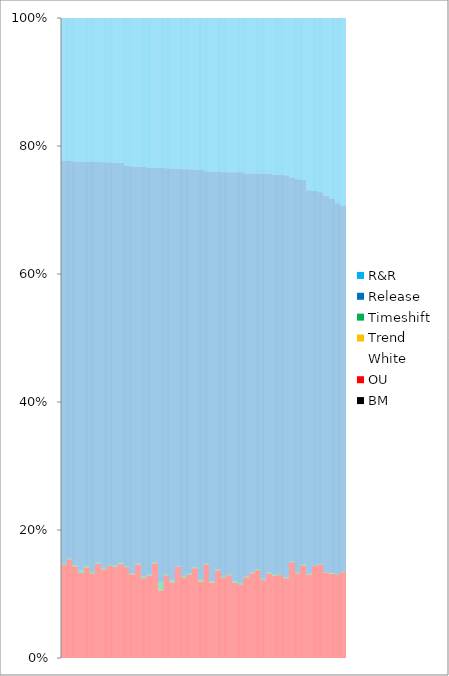
| Category | BM | OU | White | Trend | Timeshift | Release | R&R |
|---|---|---|---|---|---|---|---|
| 0 | 0 | 0.145 | 0 | 0 | 0.002 | 0.63 | 0.223 |
| 1 | 0 | 0.145 | 0 | 0 | 0.002 | 0.63 | 0.223 |
| 2 | 0 | 0.145 | 0 | 0 | 0.002 | 0.63 | 0.223 |
| 3 | 0 | 0.145 | 0 | 0 | 0.002 | 0.63 | 0.223 |
| 4 | 0 | 0.145 | 0 | 0 | 0.002 | 0.63 | 0.223 |
| 5 | 0 | 0.145 | 0 | 0 | 0.002 | 0.63 | 0.223 |
| 6 | 0 | 0.154 | 0 | 0 | 0.001 | 0.621 | 0.223 |
| 7 | 0 | 0.154 | 0 | 0 | 0.001 | 0.621 | 0.223 |
| 8 | 0 | 0.154 | 0 | 0 | 0.001 | 0.621 | 0.223 |
| 9 | 0 | 0.154 | 0 | 0 | 0.001 | 0.621 | 0.223 |
| 10 | 0 | 0.154 | 0 | 0 | 0.001 | 0.621 | 0.223 |
| 11 | 0 | 0.154 | 0 | 0 | 0.001 | 0.621 | 0.223 |
| 12 | 0 | 0.143 | 0 | 0 | 0.002 | 0.631 | 0.224 |
| 13 | 0 | 0.143 | 0 | 0 | 0.002 | 0.631 | 0.224 |
| 14 | 0 | 0.143 | 0 | 0 | 0.002 | 0.631 | 0.224 |
| 15 | 0 | 0.143 | 0 | 0 | 0.002 | 0.631 | 0.224 |
| 16 | 0 | 0.143 | 0 | 0 | 0.002 | 0.631 | 0.224 |
| 17 | 0 | 0.143 | 0 | 0 | 0.002 | 0.631 | 0.224 |
| 18 | 0 | 0.133 | 0 | 0 | 0.004 | 0.639 | 0.224 |
| 19 | 0 | 0.133 | 0 | 0 | 0.004 | 0.639 | 0.224 |
| 20 | 0 | 0.133 | 0 | 0 | 0.004 | 0.639 | 0.224 |
| 21 | 0 | 0.133 | 0 | 0 | 0.004 | 0.639 | 0.224 |
| 22 | 0 | 0.133 | 0 | 0 | 0.004 | 0.639 | 0.224 |
| 23 | 0 | 0.133 | 0 | 0 | 0.004 | 0.639 | 0.224 |
| 24 | 0 | 0.141 | 0 | 0 | 0.003 | 0.631 | 0.225 |
| 25 | 0 | 0.141 | 0 | 0 | 0.003 | 0.631 | 0.225 |
| 26 | 0 | 0.141 | 0 | 0 | 0.003 | 0.631 | 0.225 |
| 27 | 0 | 0.141 | 0 | 0 | 0.003 | 0.631 | 0.225 |
| 28 | 0 | 0.141 | 0 | 0 | 0.003 | 0.631 | 0.225 |
| 29 | 0 | 0.141 | 0 | 0 | 0.003 | 0.631 | 0.225 |
| 30 | 0 | 0.132 | 0 | 0 | 0.003 | 0.64 | 0.225 |
| 31 | 0 | 0.132 | 0 | 0 | 0.003 | 0.64 | 0.225 |
| 32 | 0 | 0.132 | 0 | 0 | 0.003 | 0.64 | 0.225 |
| 33 | 0 | 0.132 | 0 | 0 | 0.003 | 0.64 | 0.225 |
| 34 | 0 | 0.132 | 0 | 0 | 0.003 | 0.64 | 0.225 |
| 35 | 0 | 0.132 | 0 | 0 | 0.003 | 0.64 | 0.225 |
| 36 | 0 | 0.147 | 0 | 0 | 0.002 | 0.626 | 0.225 |
| 37 | 0 | 0.147 | 0 | 0 | 0.002 | 0.626 | 0.225 |
| 38 | 0 | 0.147 | 0 | 0 | 0.002 | 0.626 | 0.225 |
| 39 | 0 | 0.147 | 0 | 0 | 0.002 | 0.626 | 0.225 |
| 40 | 0 | 0.147 | 0 | 0 | 0.002 | 0.626 | 0.225 |
| 41 | 0 | 0.147 | 0 | 0 | 0.002 | 0.626 | 0.225 |
| 42 | 0 | 0.138 | 0 | 0 | 0.003 | 0.634 | 0.225 |
| 43 | 0 | 0.138 | 0 | 0 | 0.003 | 0.634 | 0.225 |
| 44 | 0 | 0.138 | 0 | 0 | 0.003 | 0.634 | 0.225 |
| 45 | 0 | 0.138 | 0 | 0 | 0.003 | 0.634 | 0.225 |
| 46 | 0 | 0.138 | 0 | 0 | 0.003 | 0.634 | 0.225 |
| 47 | 0 | 0.138 | 0 | 0 | 0.003 | 0.634 | 0.225 |
| 48 | 0 | 0.144 | 0 | 0 | 0.002 | 0.629 | 0.226 |
| 49 | 0 | 0.144 | 0 | 0 | 0.002 | 0.629 | 0.226 |
| 50 | 0 | 0.144 | 0 | 0 | 0.002 | 0.629 | 0.226 |
| 51 | 0 | 0.144 | 0 | 0 | 0.002 | 0.629 | 0.226 |
| 52 | 0 | 0.144 | 0 | 0 | 0.002 | 0.629 | 0.226 |
| 53 | 0 | 0.144 | 0 | 0 | 0.002 | 0.629 | 0.226 |
| 54 | 0 | 0.142 | 0 | 0 | 0.002 | 0.629 | 0.227 |
| 55 | 0 | 0.142 | 0 | 0 | 0.002 | 0.629 | 0.227 |
| 56 | 0 | 0.142 | 0 | 0 | 0.002 | 0.629 | 0.227 |
| 57 | 0 | 0.142 | 0 | 0 | 0.002 | 0.629 | 0.227 |
| 58 | 0 | 0.142 | 0 | 0 | 0.002 | 0.629 | 0.227 |
| 59 | 0 | 0.142 | 0 | 0 | 0.002 | 0.629 | 0.227 |
| 60 | 0 | 0.146 | 0 | 0 | 0.002 | 0.624 | 0.227 |
| 61 | 0 | 0.146 | 0 | 0 | 0.002 | 0.624 | 0.227 |
| 62 | 0 | 0.146 | 0 | 0 | 0.002 | 0.624 | 0.227 |
| 63 | 0 | 0.146 | 0 | 0 | 0.002 | 0.624 | 0.227 |
| 64 | 0 | 0.146 | 0 | 0 | 0.002 | 0.624 | 0.227 |
| 65 | 0 | 0.146 | 0 | 0 | 0.002 | 0.624 | 0.227 |
| 66 | 0 | 0.142 | 0 | 0 | 0.001 | 0.626 | 0.231 |
| 67 | 0 | 0.142 | 0 | 0 | 0.001 | 0.626 | 0.231 |
| 68 | 0 | 0.142 | 0 | 0 | 0.001 | 0.626 | 0.231 |
| 69 | 0 | 0.142 | 0 | 0 | 0.001 | 0.626 | 0.231 |
| 70 | 0 | 0.142 | 0 | 0 | 0.001 | 0.626 | 0.231 |
| 71 | 0 | 0.142 | 0 | 0 | 0.001 | 0.626 | 0.231 |
| 72 | 0 | 0.13 | 0 | 0 | 0.002 | 0.635 | 0.232 |
| 73 | 0 | 0.13 | 0 | 0 | 0.002 | 0.635 | 0.232 |
| 74 | 0 | 0.13 | 0 | 0 | 0.002 | 0.635 | 0.232 |
| 75 | 0 | 0.13 | 0 | 0 | 0.002 | 0.635 | 0.232 |
| 76 | 0 | 0.13 | 0 | 0 | 0.002 | 0.635 | 0.232 |
| 77 | 0 | 0.13 | 0 | 0 | 0.002 | 0.635 | 0.232 |
| 78 | 0 | 0.146 | 0 | 0 | 0.002 | 0.62 | 0.232 |
| 79 | 0 | 0.146 | 0 | 0 | 0.002 | 0.62 | 0.232 |
| 80 | 0 | 0.146 | 0 | 0 | 0.002 | 0.62 | 0.232 |
| 81 | 0 | 0.146 | 0 | 0 | 0.002 | 0.62 | 0.232 |
| 82 | 0 | 0.146 | 0 | 0 | 0.002 | 0.62 | 0.232 |
| 83 | 0 | 0.146 | 0 | 0 | 0.002 | 0.62 | 0.232 |
| 84 | 0 | 0.124 | 0 | 0 | 0.003 | 0.64 | 0.233 |
| 85 | 0 | 0.124 | 0 | 0 | 0.003 | 0.64 | 0.233 |
| 86 | 0 | 0.124 | 0 | 0 | 0.003 | 0.64 | 0.233 |
| 87 | 0 | 0.124 | 0 | 0 | 0.003 | 0.64 | 0.233 |
| 88 | 0 | 0.124 | 0 | 0 | 0.003 | 0.64 | 0.233 |
| 89 | 0 | 0.124 | 0 | 0 | 0.003 | 0.64 | 0.233 |
| 90 | 0 | 0.128 | 0 | 0 | 0.002 | 0.635 | 0.234 |
| 91 | 0 | 0.128 | 0 | 0 | 0.002 | 0.635 | 0.234 |
| 92 | 0 | 0.128 | 0 | 0 | 0.002 | 0.635 | 0.234 |
| 93 | 0 | 0.128 | 0 | 0 | 0.002 | 0.635 | 0.234 |
| 94 | 0 | 0.128 | 0 | 0 | 0.002 | 0.635 | 0.234 |
| 95 | 0 | 0.128 | 0 | 0 | 0.002 | 0.635 | 0.234 |
| 96 | 0 | 0.148 | 0 | 0 | 0.001 | 0.616 | 0.234 |
| 97 | 0 | 0.148 | 0 | 0 | 0.001 | 0.616 | 0.234 |
| 98 | 0 | 0.148 | 0 | 0 | 0.001 | 0.616 | 0.234 |
| 99 | 0 | 0.148 | 0 | 0 | 0.001 | 0.616 | 0.234 |
| 100 | 0 | 0.148 | 0 | 0 | 0.001 | 0.616 | 0.234 |
| 101 | 0 | 0.148 | 0 | 0 | 0.001 | 0.616 | 0.234 |
| 102 | 0 | 0.106 | 0 | 0 | 0.013 | 0.647 | 0.234 |
| 103 | 0 | 0.106 | 0 | 0 | 0.013 | 0.647 | 0.234 |
| 104 | 0 | 0.106 | 0 | 0 | 0.013 | 0.647 | 0.234 |
| 105 | 0 | 0.106 | 0 | 0 | 0.013 | 0.647 | 0.234 |
| 106 | 0 | 0.106 | 0 | 0 | 0.013 | 0.647 | 0.234 |
| 107 | 0 | 0.106 | 0 | 0 | 0.013 | 0.647 | 0.234 |
| 108 | 0 | 0.129 | 0 | 0 | 0.002 | 0.634 | 0.235 |
| 109 | 0 | 0.129 | 0 | 0 | 0.002 | 0.634 | 0.235 |
| 110 | 0 | 0.129 | 0 | 0 | 0.002 | 0.634 | 0.235 |
| 111 | 0 | 0.129 | 0 | 0 | 0.002 | 0.634 | 0.235 |
| 112 | 0 | 0.129 | 0 | 0 | 0.002 | 0.634 | 0.235 |
| 113 | 0 | 0.129 | 0 | 0 | 0.002 | 0.634 | 0.235 |
| 114 | 0 | 0.118 | 0 | 0 | 0.003 | 0.644 | 0.235 |
| 115 | 0 | 0.118 | 0 | 0 | 0.003 | 0.644 | 0.235 |
| 116 | 0 | 0.118 | 0 | 0 | 0.003 | 0.644 | 0.235 |
| 117 | 0 | 0.118 | 0 | 0 | 0.003 | 0.644 | 0.235 |
| 118 | 0 | 0.118 | 0 | 0 | 0.003 | 0.644 | 0.235 |
| 119 | 0 | 0.118 | 0 | 0 | 0.003 | 0.644 | 0.235 |
| 120 | 0 | 0.142 | 0 | 0 | 0.001 | 0.621 | 0.236 |
| 121 | 0 | 0.142 | 0 | 0 | 0.001 | 0.621 | 0.236 |
| 122 | 0 | 0.142 | 0 | 0 | 0.001 | 0.621 | 0.236 |
| 123 | 0 | 0.142 | 0 | 0 | 0.001 | 0.621 | 0.236 |
| 124 | 0 | 0.142 | 0 | 0 | 0.001 | 0.621 | 0.236 |
| 125 | 0 | 0.142 | 0 | 0 | 0.001 | 0.621 | 0.236 |
| 126 | 0 | 0.125 | 0 | 0 | 0.003 | 0.635 | 0.236 |
| 127 | 0 | 0.125 | 0 | 0 | 0.003 | 0.635 | 0.236 |
| 128 | 0 | 0.125 | 0 | 0 | 0.003 | 0.635 | 0.236 |
| 129 | 0 | 0.125 | 0 | 0 | 0.003 | 0.635 | 0.236 |
| 130 | 0 | 0.125 | 0 | 0 | 0.003 | 0.635 | 0.236 |
| 131 | 0 | 0.125 | 0 | 0 | 0.003 | 0.635 | 0.236 |
| 132 | 0 | 0.13 | 0 | 0 | 0.002 | 0.631 | 0.236 |
| 133 | 0 | 0.13 | 0 | 0 | 0.002 | 0.631 | 0.236 |
| 134 | 0 | 0.13 | 0 | 0 | 0.002 | 0.631 | 0.236 |
| 135 | 0 | 0.13 | 0 | 0 | 0.002 | 0.631 | 0.236 |
| 136 | 0 | 0.13 | 0 | 0 | 0.002 | 0.631 | 0.236 |
| 137 | 0 | 0.13 | 0 | 0 | 0.002 | 0.631 | 0.236 |
| 138 | 0 | 0.14 | 0 | 0 | 0.002 | 0.621 | 0.237 |
| 139 | 0 | 0.14 | 0 | 0 | 0.002 | 0.621 | 0.237 |
| 140 | 0 | 0.14 | 0 | 0 | 0.002 | 0.621 | 0.237 |
| 141 | 0 | 0.14 | 0 | 0 | 0.002 | 0.621 | 0.237 |
| 142 | 0 | 0.14 | 0 | 0 | 0.002 | 0.621 | 0.237 |
| 143 | 0 | 0.14 | 0 | 0 | 0.002 | 0.621 | 0.237 |
| 144 | 0 | 0.119 | 0 | 0 | 0.003 | 0.64 | 0.237 |
| 145 | 0 | 0.119 | 0 | 0 | 0.003 | 0.64 | 0.237 |
| 146 | 0 | 0.119 | 0 | 0 | 0.003 | 0.64 | 0.237 |
| 147 | 0 | 0.119 | 0 | 0 | 0.003 | 0.64 | 0.237 |
| 148 | 0 | 0.119 | 0 | 0 | 0.003 | 0.64 | 0.237 |
| 149 | 0 | 0.119 | 0 | 0 | 0.003 | 0.64 | 0.237 |
| 150 | 0 | 0.146 | 0 | 0 | 0.001 | 0.613 | 0.24 |
| 151 | 0 | 0.146 | 0 | 0 | 0.001 | 0.613 | 0.24 |
| 152 | 0 | 0.146 | 0 | 0 | 0.001 | 0.613 | 0.24 |
| 153 | 0 | 0.146 | 0 | 0 | 0.001 | 0.613 | 0.24 |
| 154 | 0 | 0.146 | 0 | 0 | 0.001 | 0.613 | 0.24 |
| 155 | 0 | 0.146 | 0 | 0 | 0.001 | 0.613 | 0.24 |
| 156 | 0 | 0.117 | 0 | 0 | 0.002 | 0.64 | 0.24 |
| 157 | 0 | 0.117 | 0 | 0 | 0.002 | 0.64 | 0.24 |
| 158 | 0 | 0.117 | 0 | 0 | 0.002 | 0.64 | 0.24 |
| 159 | 0 | 0.117 | 0 | 0 | 0.002 | 0.64 | 0.24 |
| 160 | 0 | 0.117 | 0 | 0 | 0.002 | 0.64 | 0.24 |
| 161 | 0 | 0.117 | 0 | 0 | 0.002 | 0.64 | 0.24 |
| 162 | 0 | 0.137 | 0 | 0 | 0.002 | 0.621 | 0.24 |
| 163 | 0 | 0.137 | 0 | 0 | 0.002 | 0.621 | 0.24 |
| 164 | 0 | 0.137 | 0 | 0 | 0.002 | 0.621 | 0.24 |
| 165 | 0 | 0.137 | 0 | 0 | 0.002 | 0.621 | 0.24 |
| 166 | 0 | 0.137 | 0 | 0 | 0.002 | 0.621 | 0.24 |
| 167 | 0 | 0.137 | 0 | 0 | 0.002 | 0.621 | 0.24 |
| 168 | 0 | 0.125 | 0 | 0 | 0.002 | 0.632 | 0.241 |
| 169 | 0 | 0.125 | 0 | 0 | 0.002 | 0.632 | 0.241 |
| 170 | 0 | 0.125 | 0 | 0 | 0.002 | 0.632 | 0.241 |
| 171 | 0 | 0.125 | 0 | 0 | 0.002 | 0.632 | 0.241 |
| 172 | 0 | 0.125 | 0 | 0 | 0.002 | 0.632 | 0.241 |
| 173 | 0 | 0.125 | 0 | 0 | 0.002 | 0.632 | 0.241 |
| 174 | 0 | 0.129 | 0 | 0 | 0.002 | 0.628 | 0.241 |
| 175 | 0 | 0.129 | 0 | 0 | 0.002 | 0.628 | 0.241 |
| 176 | 0 | 0.129 | 0 | 0 | 0.002 | 0.628 | 0.241 |
| 177 | 0 | 0.129 | 0 | 0 | 0.002 | 0.628 | 0.241 |
| 178 | 0 | 0.129 | 0 | 0 | 0.002 | 0.628 | 0.241 |
| 179 | 0 | 0.129 | 0 | 0 | 0.002 | 0.628 | 0.241 |
| 180 | 0 | 0.117 | 0 | 0 | 0.002 | 0.64 | 0.241 |
| 181 | 0 | 0.117 | 0 | 0 | 0.002 | 0.64 | 0.241 |
| 182 | 0 | 0.117 | 0 | 0 | 0.002 | 0.64 | 0.241 |
| 183 | 0 | 0.117 | 0 | 0 | 0.002 | 0.64 | 0.241 |
| 184 | 0 | 0.117 | 0 | 0 | 0.002 | 0.64 | 0.241 |
| 185 | 0 | 0.117 | 0 | 0 | 0.002 | 0.64 | 0.241 |
| 186 | 0 | 0.115 | 0 | 0 | 0.002 | 0.642 | 0.241 |
| 187 | 0 | 0.115 | 0 | 0 | 0.002 | 0.642 | 0.241 |
| 188 | 0 | 0.115 | 0 | 0 | 0.002 | 0.642 | 0.241 |
| 189 | 0 | 0.115 | 0 | 0 | 0.002 | 0.642 | 0.241 |
| 190 | 0 | 0.115 | 0 | 0 | 0.002 | 0.642 | 0.241 |
| 191 | 0 | 0.115 | 0 | 0 | 0.002 | 0.642 | 0.241 |
| 192 | 0 | 0.126 | 0 | 0 | 0.002 | 0.629 | 0.243 |
| 193 | 0 | 0.126 | 0 | 0 | 0.002 | 0.629 | 0.243 |
| 194 | 0 | 0.126 | 0 | 0 | 0.002 | 0.629 | 0.243 |
| 195 | 0 | 0.126 | 0 | 0 | 0.002 | 0.629 | 0.243 |
| 196 | 0 | 0.126 | 0 | 0 | 0.002 | 0.629 | 0.243 |
| 197 | 0 | 0.126 | 0 | 0 | 0.002 | 0.629 | 0.243 |
| 198 | 0 | 0.132 | 0 | 0 | 0.002 | 0.623 | 0.243 |
| 199 | 0 | 0.132 | 0 | 0 | 0.002 | 0.623 | 0.243 |
| 200 | 0 | 0.132 | 0 | 0 | 0.002 | 0.623 | 0.243 |
| 201 | 0 | 0.132 | 0 | 0 | 0.002 | 0.623 | 0.243 |
| 202 | 0 | 0.132 | 0 | 0 | 0.002 | 0.623 | 0.243 |
| 203 | 0 | 0.132 | 0 | 0 | 0.002 | 0.623 | 0.243 |
| 204 | 0 | 0.137 | 0 | 0 | 0.001 | 0.618 | 0.243 |
| 205 | 0 | 0.137 | 0 | 0 | 0.001 | 0.618 | 0.243 |
| 206 | 0 | 0.137 | 0 | 0 | 0.001 | 0.618 | 0.243 |
| 207 | 0 | 0.137 | 0 | 0 | 0.001 | 0.618 | 0.243 |
| 208 | 0 | 0.137 | 0 | 0 | 0.001 | 0.618 | 0.243 |
| 209 | 0 | 0.137 | 0 | 0 | 0.001 | 0.618 | 0.243 |
| 210 | 0 | 0.122 | 0 | 0 | 0.002 | 0.633 | 0.244 |
| 211 | 0 | 0.122 | 0 | 0 | 0.002 | 0.633 | 0.244 |
| 212 | 0 | 0.122 | 0 | 0 | 0.002 | 0.633 | 0.244 |
| 213 | 0 | 0.122 | 0 | 0 | 0.002 | 0.633 | 0.244 |
| 214 | 0 | 0.122 | 0 | 0 | 0.002 | 0.633 | 0.244 |
| 215 | 0 | 0.122 | 0 | 0 | 0.002 | 0.633 | 0.244 |
| 216 | 0 | 0.132 | 0 | 0 | 0.001 | 0.623 | 0.244 |
| 217 | 0 | 0.132 | 0 | 0 | 0.001 | 0.623 | 0.244 |
| 218 | 0 | 0.132 | 0 | 0 | 0.001 | 0.623 | 0.244 |
| 219 | 0 | 0.132 | 0 | 0 | 0.001 | 0.623 | 0.244 |
| 220 | 0 | 0.132 | 0 | 0 | 0.001 | 0.623 | 0.244 |
| 221 | 0 | 0.132 | 0 | 0 | 0.001 | 0.623 | 0.244 |
| 222 | 0 | 0.128 | 0 | 0 | 0.002 | 0.625 | 0.245 |
| 223 | 0 | 0.128 | 0 | 0 | 0.002 | 0.625 | 0.245 |
| 224 | 0 | 0.128 | 0 | 0 | 0.002 | 0.625 | 0.245 |
| 225 | 0 | 0.128 | 0 | 0 | 0.002 | 0.625 | 0.245 |
| 226 | 0 | 0.128 | 0 | 0 | 0.002 | 0.625 | 0.245 |
| 227 | 0 | 0.128 | 0 | 0 | 0.002 | 0.625 | 0.245 |
| 228 | 0 | 0.13 | 0 | 0 | 0.002 | 0.623 | 0.245 |
| 229 | 0 | 0.13 | 0 | 0 | 0.002 | 0.623 | 0.245 |
| 230 | 0 | 0.13 | 0 | 0 | 0.002 | 0.623 | 0.245 |
| 231 | 0 | 0.13 | 0 | 0 | 0.002 | 0.623 | 0.245 |
| 232 | 0 | 0.13 | 0 | 0 | 0.002 | 0.623 | 0.245 |
| 233 | 0 | 0.13 | 0 | 0 | 0.002 | 0.623 | 0.245 |
| 234 | 0 | 0.124 | 0 | 0 | 0.002 | 0.628 | 0.246 |
| 235 | 0 | 0.124 | 0 | 0 | 0.002 | 0.628 | 0.246 |
| 236 | 0 | 0.124 | 0 | 0 | 0.002 | 0.628 | 0.246 |
| 237 | 0 | 0.124 | 0 | 0 | 0.002 | 0.628 | 0.246 |
| 238 | 0 | 0.124 | 0 | 0 | 0.002 | 0.628 | 0.246 |
| 239 | 0 | 0.124 | 0 | 0 | 0.002 | 0.628 | 0.246 |
| 240 | 0 | 0.15 | 0 | 0 | 0.001 | 0.6 | 0.249 |
| 241 | 0 | 0.15 | 0 | 0 | 0.001 | 0.6 | 0.249 |
| 242 | 0 | 0.15 | 0 | 0 | 0.001 | 0.6 | 0.249 |
| 243 | 0 | 0.15 | 0 | 0 | 0.001 | 0.6 | 0.249 |
| 244 | 0 | 0.15 | 0 | 0 | 0.001 | 0.6 | 0.249 |
| 245 | 0 | 0.15 | 0 | 0 | 0.001 | 0.6 | 0.249 |
| 246 | 0 | 0.132 | 0 | 0 | 0.001 | 0.615 | 0.252 |
| 247 | 0 | 0.132 | 0 | 0 | 0.001 | 0.615 | 0.252 |
| 248 | 0 | 0.132 | 0 | 0 | 0.001 | 0.615 | 0.252 |
| 249 | 0 | 0.132 | 0 | 0 | 0.001 | 0.615 | 0.252 |
| 250 | 0 | 0.132 | 0 | 0 | 0.001 | 0.615 | 0.252 |
| 251 | 0 | 0.132 | 0 | 0 | 0.001 | 0.615 | 0.252 |
| 252 | 0 | 0.145 | 0 | 0 | 0.002 | 0.601 | 0.253 |
| 253 | 0 | 0.145 | 0 | 0 | 0.002 | 0.601 | 0.253 |
| 254 | 0 | 0.145 | 0 | 0 | 0.002 | 0.601 | 0.253 |
| 255 | 0 | 0.145 | 0 | 0 | 0.002 | 0.601 | 0.253 |
| 256 | 0 | 0.145 | 0 | 0 | 0.002 | 0.601 | 0.253 |
| 257 | 0 | 0.145 | 0 | 0 | 0.002 | 0.601 | 0.253 |
| 258 | 0 | 0.131 | 0 | 0 | 0.001 | 0.599 | 0.269 |
| 259 | 0 | 0.131 | 0 | 0 | 0.001 | 0.599 | 0.269 |
| 260 | 0 | 0.131 | 0 | 0 | 0.001 | 0.599 | 0.269 |
| 261 | 0 | 0.131 | 0 | 0 | 0.001 | 0.599 | 0.269 |
| 262 | 0 | 0.131 | 0 | 0 | 0.001 | 0.599 | 0.269 |
| 263 | 0 | 0.131 | 0 | 0 | 0.001 | 0.599 | 0.269 |
| 264 | 0 | 0.144 | 0 | 0 | 0.001 | 0.585 | 0.27 |
| 265 | 0 | 0.144 | 0 | 0 | 0.001 | 0.585 | 0.27 |
| 266 | 0 | 0.144 | 0 | 0 | 0.001 | 0.585 | 0.27 |
| 267 | 0 | 0.144 | 0 | 0 | 0.001 | 0.585 | 0.27 |
| 268 | 0 | 0.144 | 0 | 0 | 0.001 | 0.585 | 0.27 |
| 269 | 0 | 0.144 | 0 | 0 | 0.001 | 0.585 | 0.27 |
| 270 | 0 | 0.146 | 0 | 0 | 0.001 | 0.581 | 0.272 |
| 271 | 0 | 0.146 | 0 | 0 | 0.001 | 0.581 | 0.272 |
| 272 | 0 | 0.146 | 0 | 0 | 0.001 | 0.581 | 0.272 |
| 273 | 0 | 0.146 | 0 | 0 | 0.001 | 0.581 | 0.272 |
| 274 | 0 | 0.146 | 0 | 0 | 0.001 | 0.581 | 0.272 |
| 275 | 0 | 0.146 | 0 | 0 | 0.001 | 0.581 | 0.272 |
| 276 | 0 | 0.134 | 0 | 0 | 0.001 | 0.588 | 0.278 |
| 277 | 0 | 0.134 | 0 | 0 | 0.001 | 0.588 | 0.278 |
| 278 | 0 | 0.134 | 0 | 0 | 0.001 | 0.588 | 0.278 |
| 279 | 0 | 0.134 | 0 | 0 | 0.001 | 0.588 | 0.278 |
| 280 | 0 | 0.134 | 0 | 0 | 0.001 | 0.588 | 0.278 |
| 281 | 0 | 0.134 | 0 | 0 | 0.001 | 0.588 | 0.278 |
| 282 | 0 | 0.132 | 0 | 0 | 0.001 | 0.586 | 0.282 |
| 283 | 0 | 0.132 | 0 | 0 | 0.001 | 0.586 | 0.282 |
| 284 | 0 | 0.132 | 0 | 0 | 0.001 | 0.586 | 0.282 |
| 285 | 0 | 0.132 | 0 | 0 | 0.001 | 0.586 | 0.282 |
| 286 | 0 | 0.132 | 0 | 0 | 0.001 | 0.586 | 0.282 |
| 287 | 0 | 0.132 | 0 | 0 | 0.001 | 0.586 | 0.282 |
| 288 | 0 | 0.131 | 0 | 0 | 0.001 | 0.579 | 0.289 |
| 289 | 0 | 0.131 | 0 | 0 | 0.001 | 0.579 | 0.289 |
| 290 | 0 | 0.131 | 0 | 0 | 0.001 | 0.579 | 0.289 |
| 291 | 0 | 0.131 | 0 | 0 | 0.001 | 0.579 | 0.289 |
| 292 | 0 | 0.131 | 0 | 0 | 0.001 | 0.579 | 0.289 |
| 293 | 0 | 0.131 | 0 | 0 | 0.001 | 0.579 | 0.289 |
| 294 | 0 | 0.134 | 0 | 0 | 0.001 | 0.572 | 0.293 |
| 295 | 0 | 0.134 | 0 | 0 | 0.001 | 0.572 | 0.293 |
| 296 | 0 | 0.134 | 0 | 0 | 0.001 | 0.572 | 0.293 |
| 297 | 0 | 0.134 | 0 | 0 | 0.001 | 0.572 | 0.293 |
| 298 | 0 | 0.134 | 0 | 0 | 0.001 | 0.572 | 0.293 |
| 299 | 0 | 0.134 | 0 | 0 | 0.001 | 0.572 | 0.293 |